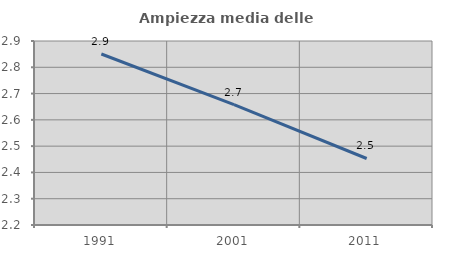
| Category | Ampiezza media delle famiglie |
|---|---|
| 1991.0 | 2.851 |
| 2001.0 | 2.658 |
| 2011.0 | 2.453 |